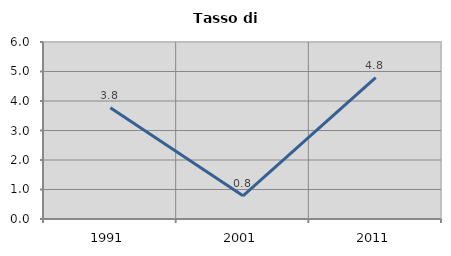
| Category | Tasso di disoccupazione   |
|---|---|
| 1991.0 | 3.774 |
| 2001.0 | 0.787 |
| 2011.0 | 4.79 |